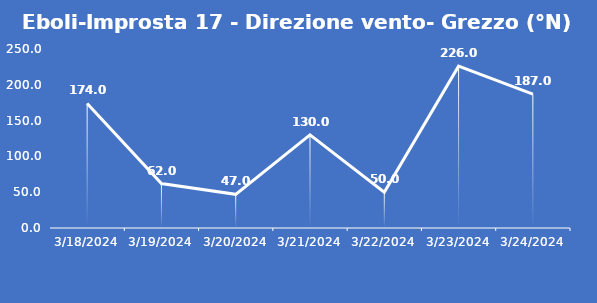
| Category | Eboli-Improsta 17 - Direzione vento- Grezzo (°N) |
|---|---|
| 3/18/24 | 174 |
| 3/19/24 | 62 |
| 3/20/24 | 47 |
| 3/21/24 | 130 |
| 3/22/24 | 50 |
| 3/23/24 | 226 |
| 3/24/24 | 187 |